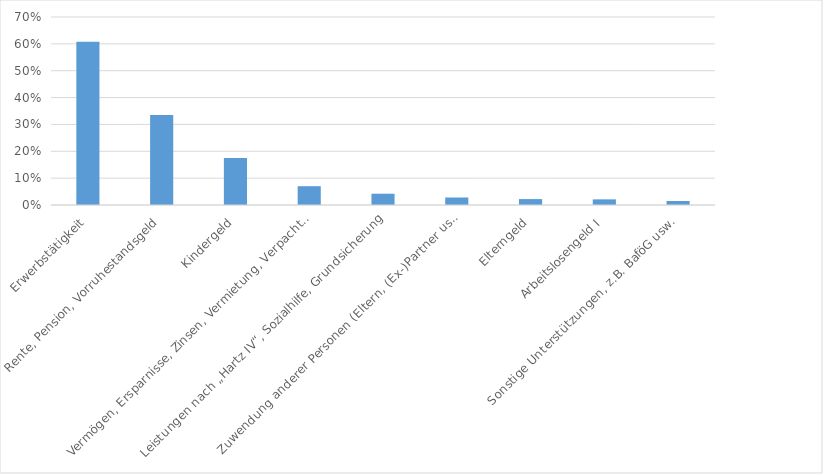
| Category | Series 0 |
|---|---|
| Erwerbstätigkeit | 0.608 |
| Rente, Pension, Vorruhestandsgeld | 0.335 |
| Kindergeld | 0.175 |
| Vermögen, Ersparnisse, Zinsen, Vermietung, Verpachtung | 0.07 |
| Leistungen nach „Hartz IV“, Sozialhilfe, Grundsicherung | 0.042 |
| Zuwendung anderer Personen (Eltern, (Ex-)Partner usw.) | 0.028 |
| Elterngeld | 0.022 |
| Arbeitslosengeld I | 0.021 |
| Sonstige Unterstützungen, z.B. BaföG usw. | 0.015 |